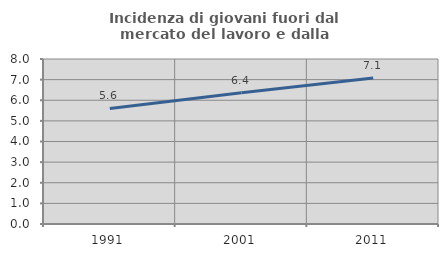
| Category | Incidenza di giovani fuori dal mercato del lavoro e dalla formazione  |
|---|---|
| 1991.0 | 5.604 |
| 2001.0 | 6.365 |
| 2011.0 | 7.079 |